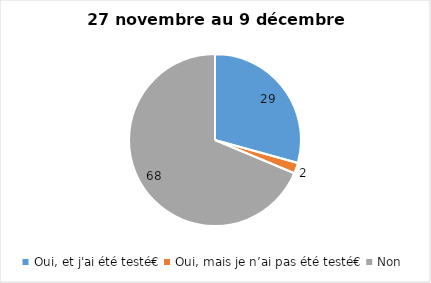
| Category | Series 0 |
|---|---|
| Oui, et j'ai été testé€ | 29 |
| Oui, mais je n’ai pas été testé€ | 2 |
| Non | 68 |